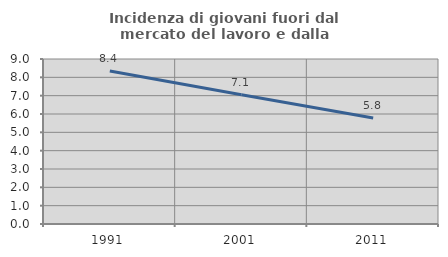
| Category | Incidenza di giovani fuori dal mercato del lavoro e dalla formazione  |
|---|---|
| 1991.0 | 8.351 |
| 2001.0 | 7.052 |
| 2011.0 | 5.779 |